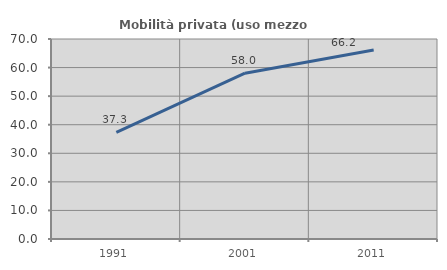
| Category | Mobilità privata (uso mezzo privato) |
|---|---|
| 1991.0 | 37.326 |
| 2001.0 | 58.045 |
| 2011.0 | 66.171 |